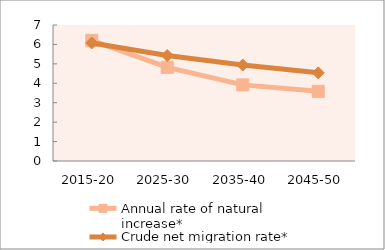
| Category | Annual rate of natural increase* | Crude net migration rate* |
|---|---|---|
| 2015-20 | 6.211 | 6.077 |
| 2025-30 | 4.82 | 5.429 |
| 2035-40 | 3.918 | 4.939 |
| 2045-50 | 3.586 | 4.537 |